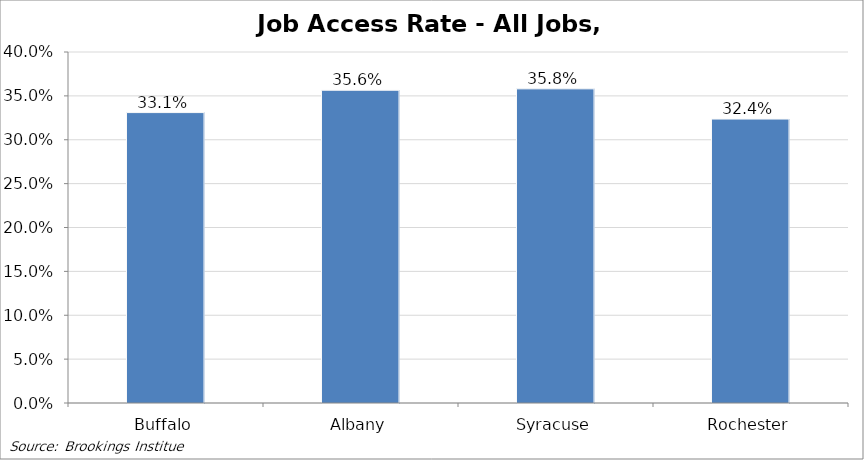
| Category | Job Access Rate - All Jobs All |
|---|---|
| Buffalo | 0.331 |
| Albany | 0.356 |
| Syracuse | 0.358 |
| Rochester | 0.324 |